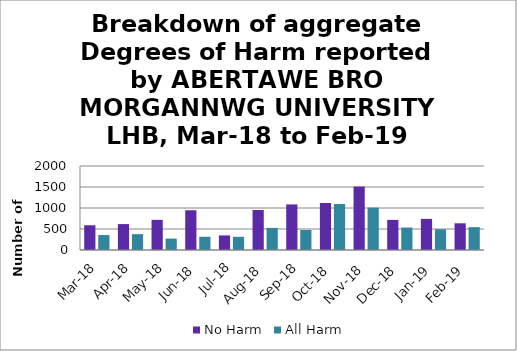
| Category | No Harm | All Harm |
|---|---|---|
| Mar-18 | 589 | 356 |
| Apr-18 | 617 | 377 |
| May-18 | 718 | 271 |
| Jun-18 | 946 | 315 |
| Jul-18 | 347 | 314 |
| Aug-18 | 953 | 526 |
| Sep-18 | 1085 | 477 |
| Oct-18 | 1119 | 1095 |
| Nov-18 | 1510 | 1009 |
| Dec-18 | 717 | 534 |
| Jan-19 | 741 | 493 |
| Feb-19 | 636 | 544 |